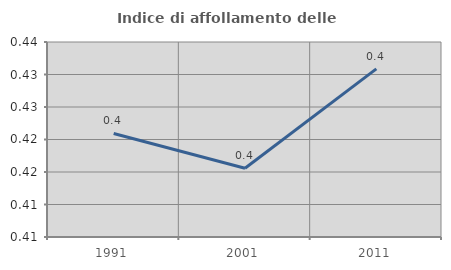
| Category | Indice di affollamento delle abitazioni  |
|---|---|
| 1991.0 | 0.421 |
| 2001.0 | 0.416 |
| 2011.0 | 0.431 |